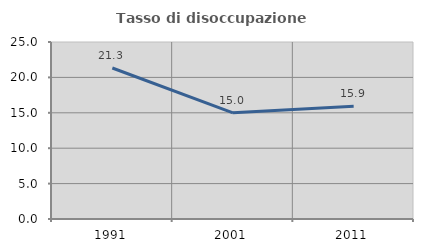
| Category | Tasso di disoccupazione giovanile  |
|---|---|
| 1991.0 | 21.324 |
| 2001.0 | 15 |
| 2011.0 | 15.942 |